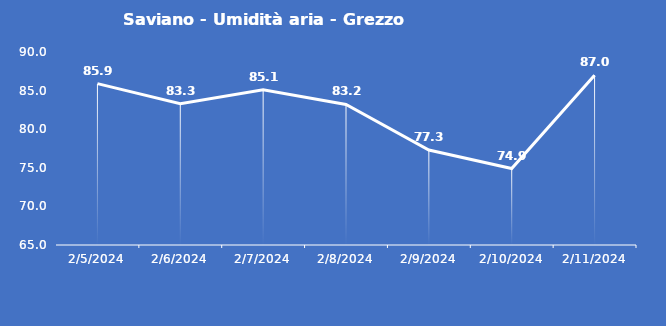
| Category | Saviano - Umidità aria - Grezzo (%) |
|---|---|
| 2/5/24 | 85.9 |
| 2/6/24 | 83.3 |
| 2/7/24 | 85.1 |
| 2/8/24 | 83.2 |
| 2/9/24 | 77.3 |
| 2/10/24 | 74.9 |
| 2/11/24 | 87 |